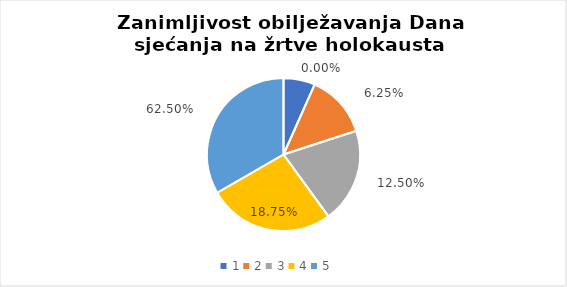
| Category | Series 0 | Series 1 |
|---|---|---|
| 0 | 1 | 0 |
| 1 | 2 | 0.062 |
| 2 | 3 | 0.125 |
| 3 | 4 | 0.188 |
| 4 | 5 | 0.625 |